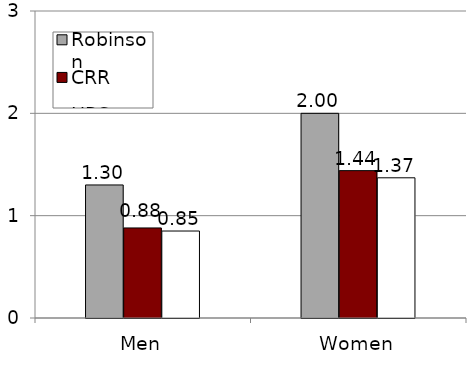
| Category | Robinson | CRR  | HRS |
|---|---|---|---|
| Men | 1.3 | 0.88 | 0.85 |
| Women | 2 | 1.44 | 1.37 |